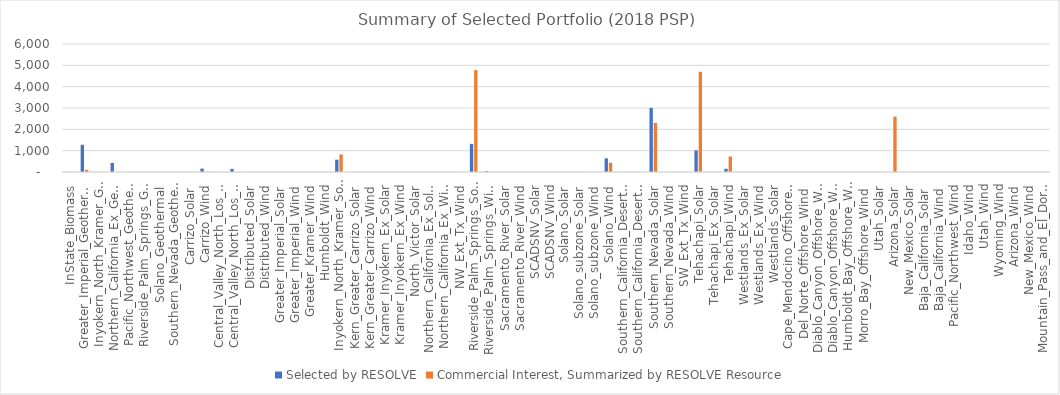
| Category | Selected by RESOLVE |  Commercial Interest, Summarized by RESOLVE Resource  |
|---|---|---|
| InState_Biomass | 0 | 0 |
| Greater_Imperial_Geothermal | 1276 | 100 |
| Inyokern_North_Kramer_Geothermal | 0 | 0 |
| Northern_California_Ex_Geothermal | 424 | 0 |
| Pacific_Northwest_Geothermal | 0 | 0 |
| Riverside_Palm_Springs_Geothermal | 0 | 0 |
| Solano_Geothermal | 0 | 0 |
| Southern_Nevada_Geothermal | 0 | 0 |
| Carrizo_Solar | 0 | 0 |
| Carrizo_Wind | 160 | 0 |
| Central_Valley_North_Los_Banos_Solar | 0 | 0 |
| Central_Valley_North_Los_Banos_Wind | 146 | 0 |
| Distributed_Solar | 0 | 0 |
| Distributed_Wind | 0 | 0 |
| Greater_Imperial_Solar | 0 | 0 |
| Greater_Imperial_Wind | 0 | 0 |
| Greater_Kramer_Wind | 0 | 0 |
| Humboldt_Wind | 0 | 0 |
| Inyokern_North_Kramer_Solar | 577 | 824.26 |
| Kern_Greater_Carrizo_Solar | 0 | 0 |
| Kern_Greater_Carrizo_Wind | 0 | 0 |
| Kramer_Inyokern_Ex_Solar | 0 | 0 |
| Kramer_Inyokern_Ex_Wind | 0 | 0 |
| North_Victor_Solar | 0 | 0 |
| Northern_California_Ex_Solar | 0 | 0 |
| Northern_California_Ex_Wind | 0 | 0 |
| NW_Ext_Tx_Wind | 0 | 0 |
| Riverside_Palm_Springs_Solar | 1320 | 4777.38 |
| Riverside_Palm_Springs_Wind | 42 | 0 |
| Sacramento_River_Solar | 0 | 0 |
| Sacramento_River_Wind | 0 | 0 |
| SCADSNV_Solar | 0 | 0 |
| SCADSNV_Wind | 0 | 0 |
| Solano_Solar | 0 | 0 |
| Solano_subzone_Solar | 0 | 0 |
| Solano_subzone_Wind | 0 | 0 |
| Solano_Wind | 643 | 433.704 |
| Southern_California_Desert_Ex_Solar | 0 | 0 |
| Southern_California_Desert_Ex_Wind | 0 | 0 |
| Southern_Nevada_Solar | 3006 | 2300.104 |
| Southern_Nevada_Wind | 0 | 0 |
| SW_Ext_Tx_Wind | 0 | 0 |
| Tehachapi_Solar | 1013 | 4697.912 |
| Tehachapi_Ex_Solar | 0 | 0 |
| Tehachapi_Wind | 153 | 728.66 |
| Westlands_Ex_Solar | 0 | 0 |
| Westlands_Ex_Wind | 0 | 0 |
| Westlands_Solar | 0 | 0 |
| Cape_Mendocino_Offshore_Wind | 0 | 0 |
| Del_Norte_Offshore_Wind | 0 | 0 |
| Diablo_Canyon_Offshore_Wind_Ext_Tx | 0 | 0 |
| Diablo_Canyon_Offshore_Wind | 0 | 0 |
| Humboldt_Bay_Offshore_Wind | 0 | 0 |
| Morro_Bay_Offshore_Wind | 0 | 0 |
| Utah_Solar | 0 | 0 |
| Arizona_Solar | 0 | 2595 |
| New_Mexico_Solar | 0 | 0 |
| Baja_California_Solar | 0 | 0 |
| Baja_California_Wind | 0 | 0 |
| Pacific_Northwest_Wind | 0 | 0 |
| Idaho_Wind | 0 | 0 |
| Utah_Wind | 0 | 0 |
| Wyoming_Wind | 0 | 0 |
| Arizona_Wind | 0 | 0 |
| New_Mexico_Wind | 0 | 0 |
| Mountain_Pass_and_El_Dorado  | 0 | 0 |